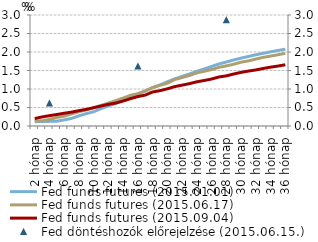
| Category | Fed funds futures (2015.01.01) | Fed funds futures (2015.06.17) | Fed funds futures (2015.09.04) |
|---|---|---|---|
| 2 hónap | 0.115 | 0.135 | 0.2 |
| 3 hónap | 0.125 | 0.14 | 0.245 |
| 4 hónap | 0.125 | 0.18 | 0.28 |
| 5 hónap | 0.13 | 0.23 | 0.31 |
| 6 hónap | 0.165 | 0.265 | 0.345 |
| 7 hónap | 0.205 | 0.325 | 0.375 |
| 8 hónap | 0.275 | 0.385 | 0.415 |
| 9 hónap | 0.335 | 0.435 | 0.45 |
| 10 hónap | 0.385 | 0.495 | 0.495 |
| 11 hónap | 0.47 | 0.555 | 0.54 |
| 12 hónap | 0.545 | 0.62 | 0.585 |
| 13 hónap | 0.61 | 0.685 | 0.62 |
| 14 hónap | 0.705 | 0.755 | 0.675 |
| 15 hónap | 0.79 | 0.83 | 0.74 |
| 16 hónap | 0.86 | 0.875 | 0.795 |
| 17 hónap | 0.94 | 0.95 | 0.835 |
| 18 hónap | 1.04 | 1.035 | 0.92 |
| 19 hónap | 1.11 | 1.1 | 0.955 |
| 20 hónap | 1.195 | 1.155 | 1.005 |
| 21 hónap | 1.275 | 1.255 | 1.065 |
| 22 hónap | 1.34 | 1.31 | 1.105 |
| 23 hónap | 1.405 | 1.365 | 1.145 |
| 24 hónap | 1.48 | 1.435 | 1.195 |
| 25 hónap | 1.54 | 1.48 | 1.23 |
| 26 hónap | 1.61 | 1.525 | 1.27 |
| 27 hónap | 1.675 | 1.585 | 1.325 |
| 28 hónap | 1.73 | 1.625 | 1.355 |
| 29 hónap | 1.785 | 1.67 | 1.405 |
| 30 hónap | 1.835 | 1.725 | 1.45 |
| 31 hónap | 1.88 | 1.76 | 1.485 |
| 32 hónap | 1.925 | 1.81 | 1.515 |
| 33 hónap | 1.965 | 1.855 | 1.555 |
| 34 hónap | 2.005 | 1.89 | 1.59 |
| 35 hónap | 2.04 | 1.925 | 1.62 |
| 36 hónap | 2.075 | 1.965 | 1.655 |